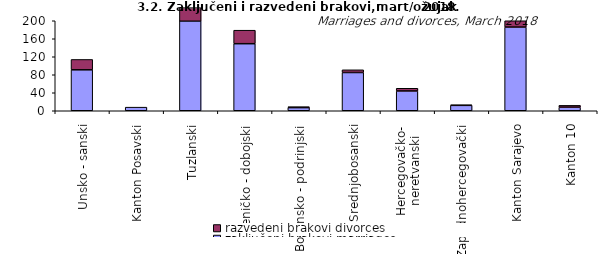
| Category | zaključeni brakovi marriages | razvedeni brakovi divorces |
|---|---|---|
| Unsko - sanski | 91 | 23 |
| Kanton Posavski | 8 | 0 |
| Tuzlanski | 228 | 42 |
| Zeničko - dobojski | 149 | 30 |
| Bosansko - podrinjski | 7 | 2 |
| Srednjobosanski | 85 | 6 |
| Hercegovačko-
neretvanski | 44 | 6 |
| Zapadnohercegovački | 12 | 1 |
| Kanton Sarajevo | 186 | 24 |
| Kanton 10 | 8 | 4 |